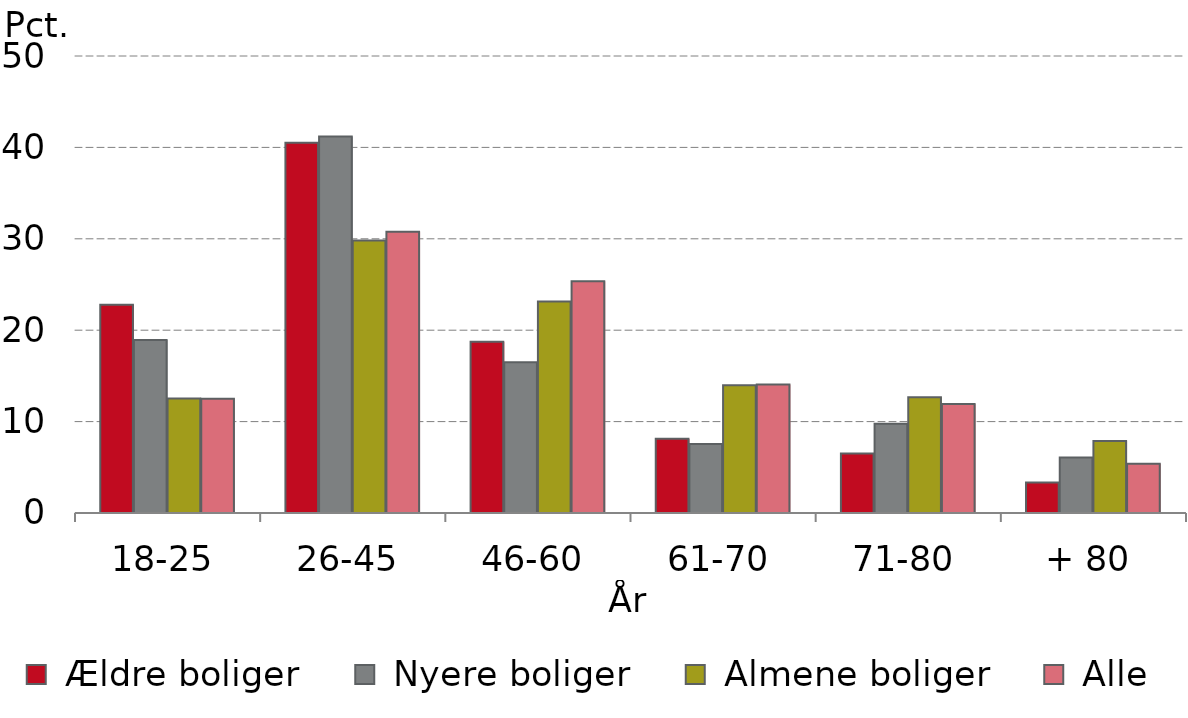
| Category |  Ældre boliger |  Nyere boliger |  Almene boliger |  Alle |
|---|---|---|---|---|
| 0 | 22.778 | 18.926 | 12.529 | 12.491 |
| 1 | 40.516 | 41.183 | 29.804 | 30.778 |
| 2 | 18.746 | 16.5 | 23.149 | 25.351 |
| 3 | 8.112 | 7.543 | 13.965 | 14.059 |
| 4 | 6.511 | 9.771 | 12.668 | 11.92 |
| 5 | 3.337 | 6.077 | 7.885 | 5.401 |